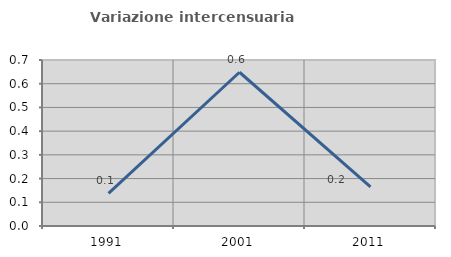
| Category | Variazione intercensuaria annua |
|---|---|
| 1991.0 | 0.137 |
| 2001.0 | 0.648 |
| 2011.0 | 0.165 |